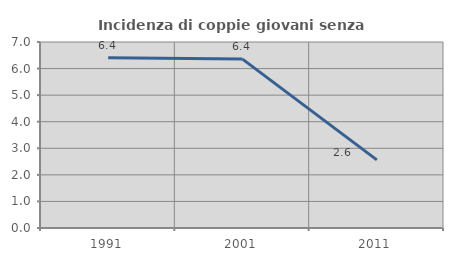
| Category | Incidenza di coppie giovani senza figli |
|---|---|
| 1991.0 | 6.41 |
| 2001.0 | 6.356 |
| 2011.0 | 2.564 |